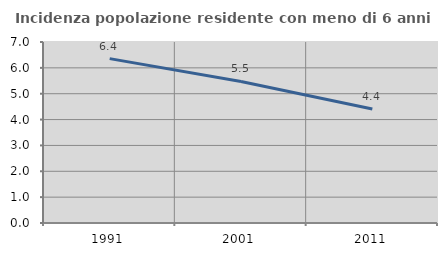
| Category | Incidenza popolazione residente con meno di 6 anni |
|---|---|
| 1991.0 | 6.356 |
| 2001.0 | 5.476 |
| 2011.0 | 4.409 |